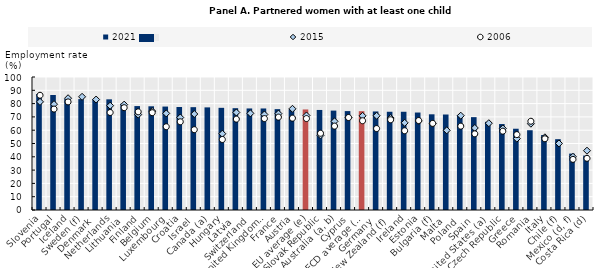
| Category | 2021 |
|---|---|
| Slovenia | 87.231 |
| Portugal | 86.471 |
| Iceland | 83.536 |
| Sweden (f) | 83.384 |
| Denmark | 83.38 |
| Netherlands | 83.208 |
| Lithuania | 79.987 |
| Finland | 78.143 |
| Belgium | 77.985 |
| Luxembourg | 77.776 |
| Croatia | 77.428 |
| Israel | 77.322 |
| Canada (a) | 77.156 |
| Hungary | 76.822 |
| Latvia | 76.551 |
| Switzerland | 76.353 |
| United Kingdom (f) | 76.341 |
| France | 75.838 |
| Austria | 75.832 |
| EU average (e) | 75.594 |
| Slovak Republic | 75.22 |
| Australia (a, b) | 74.74 |
| Cyprus | 74.369 |
| OECD average (e) | 74.304 |
| Germany | 74.098 |
| New Zealand (f) | 73.866 |
| Ireland | 73.863 |
| Estonia | 73.288 |
| Bulgaria (f) | 71.951 |
| Malta | 71.799 |
| Poland | 71.518 |
| Spain | 69.815 |
| United States (a) | 66.283 |
| Czech Republic | 64.621 |
| Greece | 61.099 |
| Romania | 59.975 |
| Italy | 56.376 |
| Chile (f) | 53.242 |
| Mexico (d, f) | 42.404 |
| Costa Rica (d) | 40.93 |